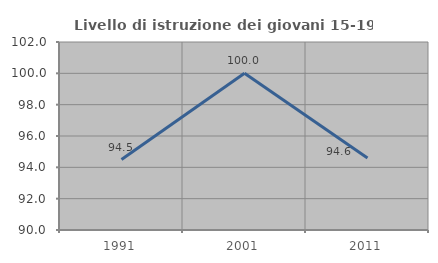
| Category | Livello di istruzione dei giovani 15-19 anni |
|---|---|
| 1991.0 | 94.495 |
| 2001.0 | 100 |
| 2011.0 | 94.595 |